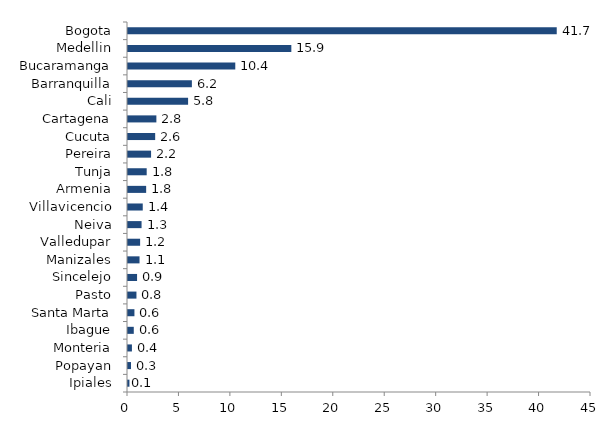
| Category | Series 0 |
|---|---|
| Ipiales | 0.139 |
| Popayan | 0.294 |
| Monteria | 0.381 |
| Ibague | 0.561 |
| Santa Marta | 0.625 |
| Pasto | 0.822 |
| Sincelejo | 0.881 |
| Manizales | 1.121 |
| Valledupar | 1.178 |
| Neiva | 1.319 |
| Villavicencio | 1.434 |
| Armenia | 1.765 |
| Tunja | 1.817 |
| Pereira | 2.243 |
| Cucuta | 2.641 |
| Cartagena | 2.758 |
| Cali | 5.84 |
| Barranquilla | 6.209 |
| Bucaramanga | 10.427 |
| Medellin | 15.875 |
| Bogota | 41.67 |